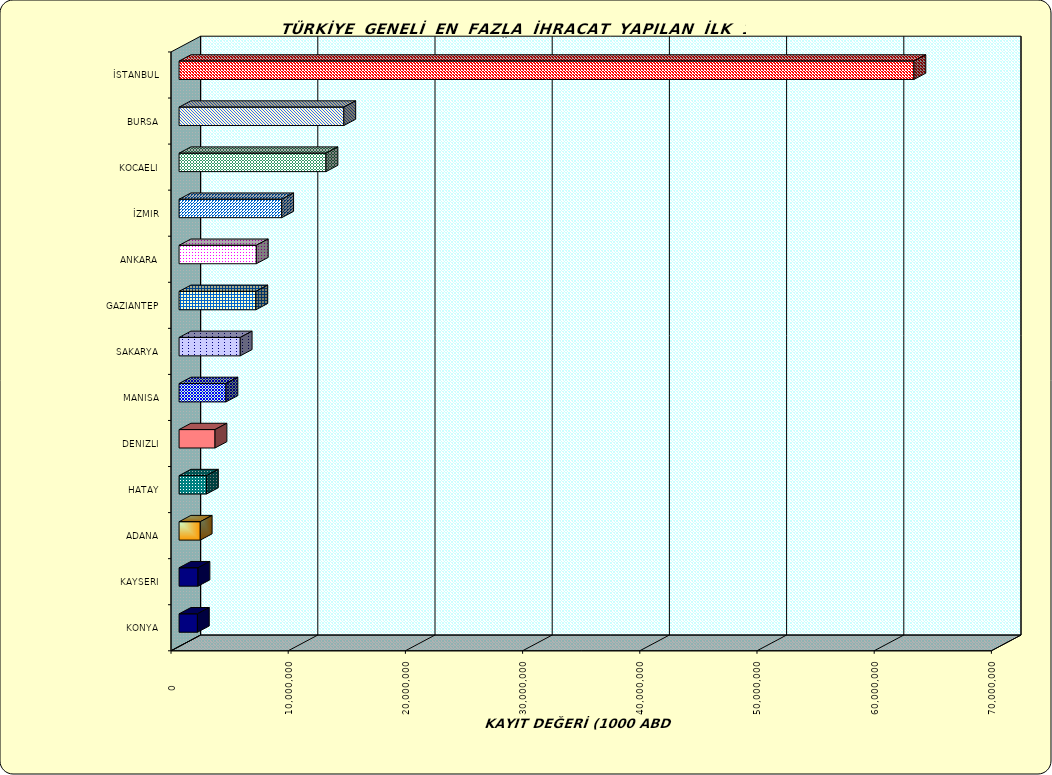
| Category | Series 0 |
|---|---|
| İSTANBUL | 62702601.39 |
| BURSA | 14058093.542 |
| KOCAELI | 12536935.606 |
| İZMIR | 8758035.899 |
| ANKARA | 6591461.473 |
| GAZIANTEP | 6552854.915 |
| SAKARYA | 5218444.737 |
| MANISA | 4001897.3 |
| DENIZLI | 3067302.603 |
| HATAY | 2336240.621 |
| ADANA | 1807915.141 |
| KAYSERI | 1613872.915 |
| KONYA | 1564646.253 |